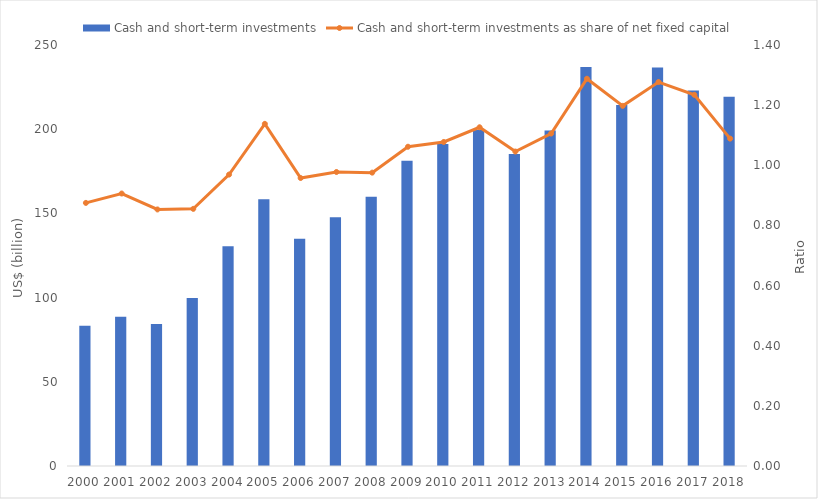
| Category | Cash and short-term investments |
|---|---|
| 2000.0 | 83.265 |
| 2001.0 | 88.601 |
| 2002.0 | 84.395 |
| 2003.0 | 99.818 |
| 2004.0 | 130.437 |
| 2005.0 | 158.394 |
| 2006.0 | 134.928 |
| 2007.0 | 147.785 |
| 2008.0 | 159.85 |
| 2009.0 | 181.201 |
| 2010.0 | 191.276 |
| 2011.0 | 199.527 |
| 2012.0 | 185.289 |
| 2013.0 | 199.182 |
| 2014.0 | 236.906 |
| 2015.0 | 214.414 |
| 2016.0 | 236.618 |
| 2017.0 | 222.969 |
| 2018.0 | 219.313 |